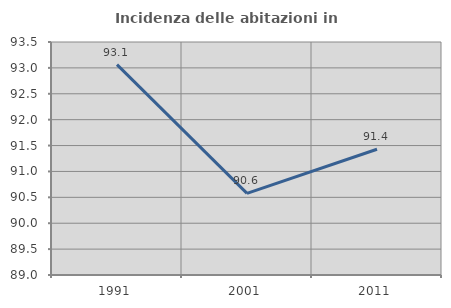
| Category | Incidenza delle abitazioni in proprietà  |
|---|---|
| 1991.0 | 93.064 |
| 2001.0 | 90.576 |
| 2011.0 | 91.429 |